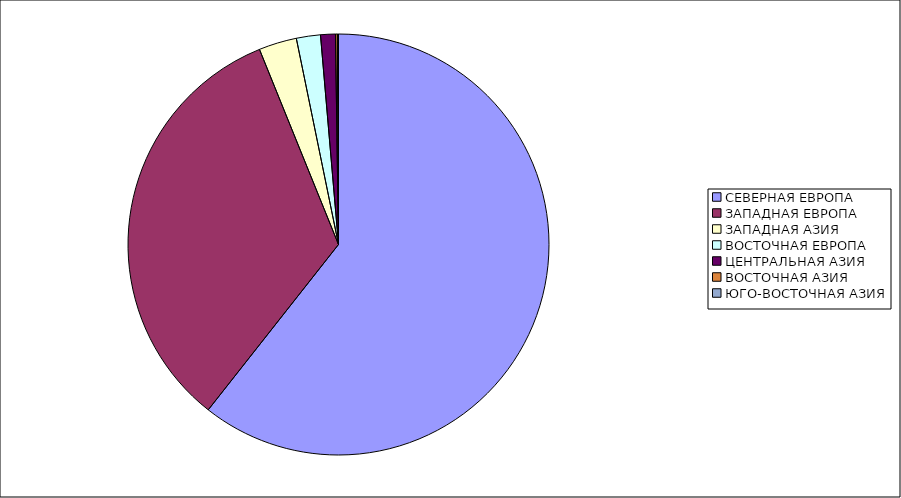
| Category | Оборот |
|---|---|
| СЕВЕРНАЯ ЕВРОПА | 60.619 |
| ЗАПАДНАЯ ЕВРОПА | 33.254 |
| ЗАПАДНАЯ АЗИЯ | 2.913 |
| ВОСТОЧНАЯ ЕВРОПА | 1.848 |
| ЦЕНТРАЛЬНАЯ АЗИЯ | 1.137 |
| ВОСТОЧНАЯ АЗИЯ | 0.14 |
| ЮГО-ВОСТОЧНАЯ АЗИЯ | 0.088 |